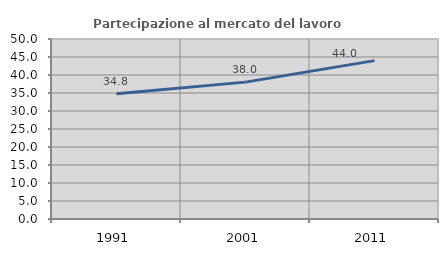
| Category | Partecipazione al mercato del lavoro  femminile |
|---|---|
| 1991.0 | 34.788 |
| 2001.0 | 38.02 |
| 2011.0 | 43.989 |